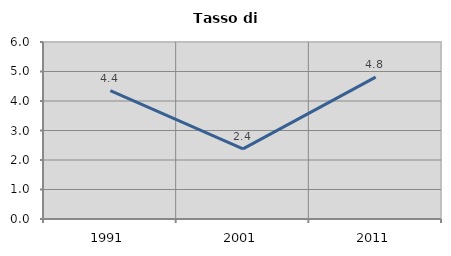
| Category | Tasso di disoccupazione   |
|---|---|
| 1991.0 | 4.352 |
| 2001.0 | 2.375 |
| 2011.0 | 4.812 |